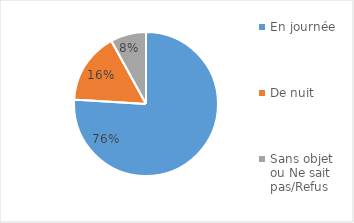
| Category | Series 0 |
|---|---|
| En journée | 0.76 |
| De nuit | 0.16 |
| Sans objet ou Ne sait pas/Refus | 0.08 |